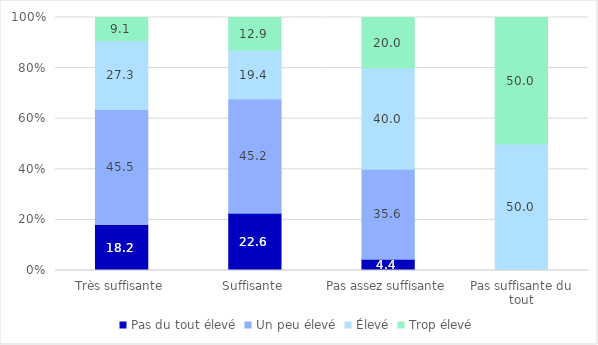
| Category | Pas du tout élevé | Un peu élevé | Élevé | Trop élevé |
|---|---|---|---|---|
| Très suffisante | 18.182 | 45.455 | 27.273 | 9.091 |
| Suffisante | 22.581 | 45.161 | 19.355 | 12.903 |
| Pas assez suffisante | 4.444 | 35.556 | 40 | 20 |
| Pas suffisante du tout | 0 | 0 | 50 | 50 |